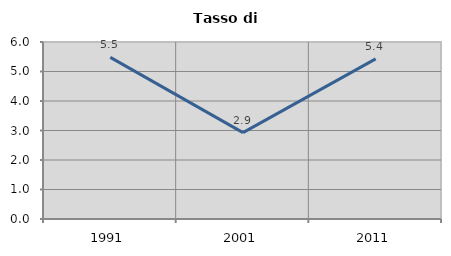
| Category | Tasso di disoccupazione   |
|---|---|
| 1991.0 | 5.479 |
| 2001.0 | 2.929 |
| 2011.0 | 5.43 |